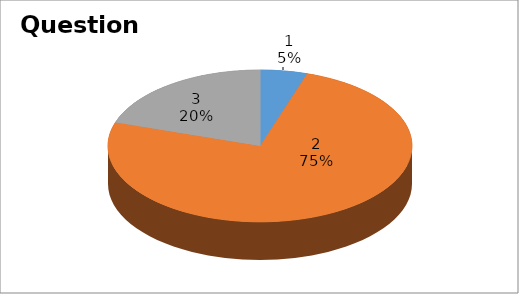
| Category | Series 0 |
|---|---|
| 0 | 1 |
| 1 | 15 |
| 2 | 4 |